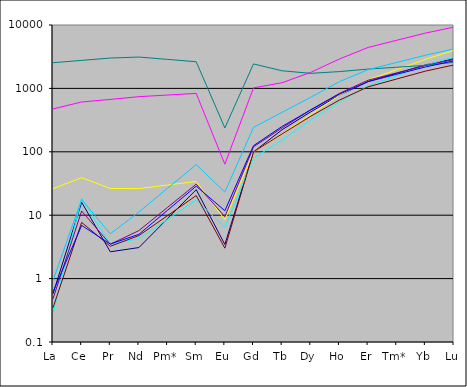
| Category | Series 0 | Series 1 | Series 2 | Series 3 | Series 4 | Series 5 | Series 6 | Series 7 | Series 8 |
|---|---|---|---|---|---|---|---|---|---|
| La | 0.574 | 474.181 | 26.276 | 0.287 | 0.481 | 0.347 | 2540.965 | 0.617 | 0.933 |
| Ce | 15.997 | 610.44 | 39.017 | 18.49 | 11.652 | 7.706 | 2765.272 | 6.901 | 17.695 |
| Pr | 2.648 | 670.102 | 26.406 | 3.463 | 3.483 | 3.233 | 3011.761 | 3.508 | 5.081 |
| Nd | 3.088 | 740.528 | 26.278 | 4.275 | 5.72 | 4.771 | 3122.226 | 4.994 | 11.249 |
| Pm* | 8.841 | 785.575 | 29.926 | 8.621 | 13.291 | 9.863 | 2867.1 | 11.974 | 26.571 |
| Sm | 25.315 | 833.362 | 34.081 | 17.386 | 30.885 | 20.389 | 2632.822 | 28.707 | 62.762 |
| Eu | 3.451 | 63.769 | 8.459 | 6.444 | 9.485 | 3.018 | 238.295 | 11.781 | 23.177 |
| Gd | 99.392 | 1018.274 | 99.438 | 79.308 | 119.748 | 99.991 | 2433.82 | 125.022 | 242.57 |
| Tb | 223.123 | 1229.546 | 193.758 | 153.076 | 238.263 | 191.906 | 1894.444 | 251.643 | 419.187 |
| Dy | 427.509 | 1793.154 | 388.566 | 317.29 | 460.879 | 364.15 | 1728.591 | 458.589 | 726.608 |
| Ho | 779.978 | 2908.634 | 777.938 | 609.422 | 834.823 | 655.095 | 1841.022 | 812.007 | 1276.582 |
| Er | 1280.655 | 4424.235 | 1361.229 | 1093.273 | 1347.257 | 1057.468 | 2017.384 | 1281.384 | 1976.728 |
| Tm* | 1732.732 | 5739.41 | 1978.436 | 1586.989 | 1755.537 | 1406.509 | 2158.776 | 1670.873 | 2566.259 |
| Yb | 2344.394 | 7445.542 | 2875.496 | 2303.662 | 2287.545 | 1870.76 | 2310.078 | 2178.751 | 3331.609 |
| Lu | 2937.69 | 9264.827 | 3987.19 | 3128.108 | 2855.335 | 2343.907 | 2579.223 | 2722.739 | 4200.579 |